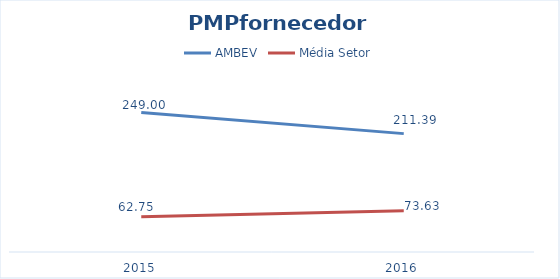
| Category | AMBEV | Média Setor |
|---|---|---|
| 2015.0 | 249 | 62.754 |
| 2016.0 | 211.386 | 73.633 |